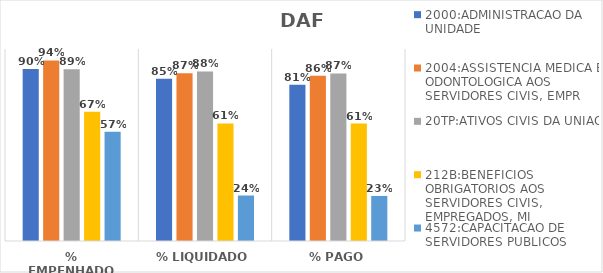
| Category | 2000:ADMINISTRACAO DA UNIDADE | 2004:ASSISTENCIA MEDICA E ODONTOLOGICA AOS SERVIDORES CIVIS, EMPR | 20TP:ATIVOS CIVIS DA UNIAO | 212B:BENEFICIOS OBRIGATORIOS AOS SERVIDORES CIVIS, EMPREGADOS, MI | 4572:CAPACITACAO DE SERVIDORES PUBLICOS FEDERAIS EM PROCESSO DE Q |
|---|---|---|---|---|---|
| % EMPENHADO | 0.896 | 0.94 | 0.895 | 0.673 | 0.569 |
| % LIQUIDADO | 0.845 | 0.874 | 0.883 | 0.612 | 0.237 |
| % PAGO | 0.814 | 0.861 | 0.873 | 0.612 | 0.235 |